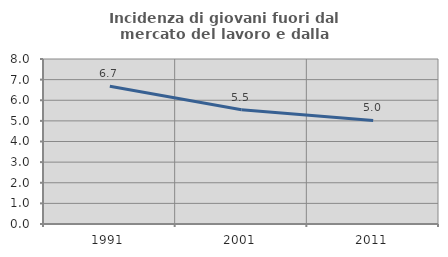
| Category | Incidenza di giovani fuori dal mercato del lavoro e dalla formazione  |
|---|---|
| 1991.0 | 6.679 |
| 2001.0 | 5.543 |
| 2011.0 | 5.019 |